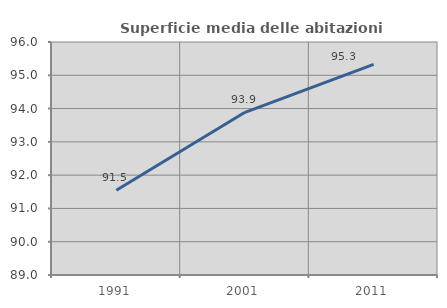
| Category | Superficie media delle abitazioni occupate |
|---|---|
| 1991.0 | 91.544 |
| 2001.0 | 93.887 |
| 2011.0 | 95.329 |